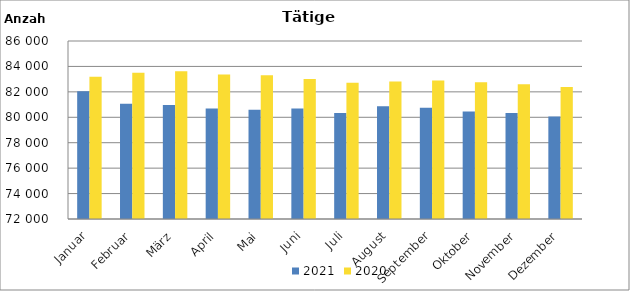
| Category | 2021 | 2020 |
|---|---|---|
| Januar | 82047 | 83189 |
| Februar | 81074 | 83502 |
| März | 80963 | 83615 |
| April | 80692 | 83368 |
| Mai | 80601 | 83302 |
| Juni | 80684 | 83012 |
| Juli | 80346 | 82717 |
| August | 80872 | 82812 |
| September | 80743 | 82887 |
| Oktober | 80463 | 82757 |
| November | 80346 | 82604 |
| Dezember | 80071 | 82381 |